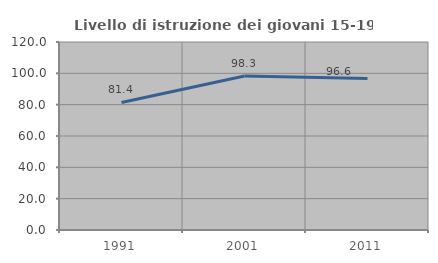
| Category | Livello di istruzione dei giovani 15-19 anni |
|---|---|
| 1991.0 | 81.421 |
| 2001.0 | 98.261 |
| 2011.0 | 96.648 |